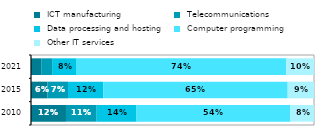
| Category |  ICT manufacturing |  Telecommunications |  Data processing and hosting |  Computer programming |  Other IT services  |
|---|---|---|---|---|---|
| 2010.0 | 0.124 | 0.108 | 0.141 | 0.544 | 0.083 |
| 2015.0 | 0.058 | 0.073 | 0.125 | 0.652 | 0.093 |
| 2021.0 | 0.036 | 0.039 | 0.084 | 0.743 | 0.098 |